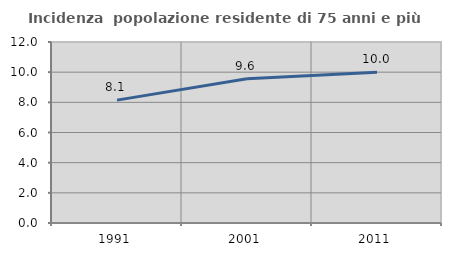
| Category | Incidenza  popolazione residente di 75 anni e più |
|---|---|
| 1991.0 | 8.147 |
| 2001.0 | 9.569 |
| 2011.0 | 10 |